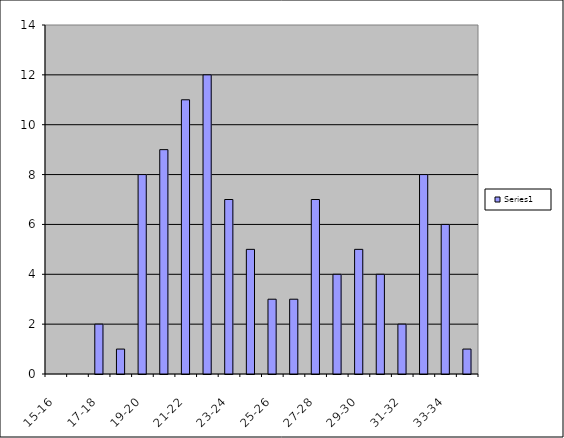
| Category | Series 0 |
|---|---|
| 15-16 | 0 |
| 16-17 | 0 |
| 17-18 | 2 |
| 18-19 | 1 |
| 19-20 | 8 |
| 20-21 | 9 |
| 21-22 | 11 |
| 22-23 | 12 |
| 23-24 | 7 |
| 24-25 | 5 |
| 25-26 | 3 |
| 26-27 | 3 |
| 27-28 | 7 |
| 28-29 | 4 |
| 29-30 | 5 |
| 30-31 | 4 |
| 31-32 | 2 |
| 32-33 | 8 |
| 33-34 | 6 |
| 34-35 | 1 |